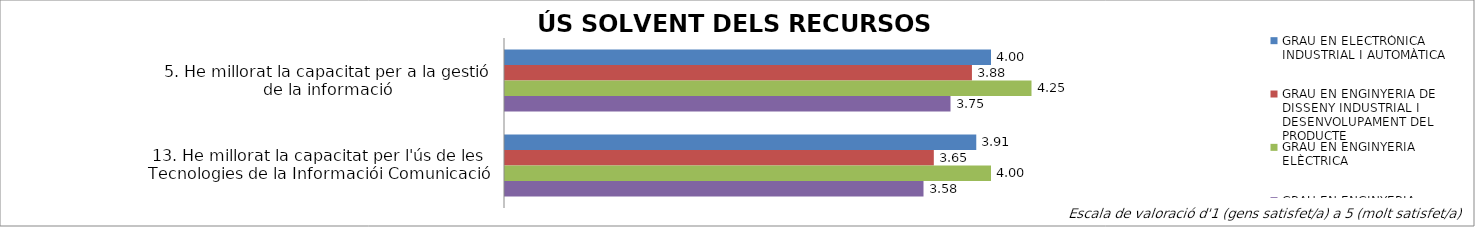
| Category | GRAU EN ELECTRÒNICA INDUSTRIAL I AUTOMÀTICA | GRAU EN ENGINYERIA DE DISSENY INDUSTRIAL I DESENVOLUPAMENT DEL PRODUCTE | GRAU EN ENGINYERIA ELÈCTRICA | GRAU EN ENGINYERIA MECÀNICA |
|---|---|---|---|---|
| 5. He millorat la capacitat per a la gestió de la informació | 4 | 3.882 | 4.25 | 3.75 |
| 13. He millorat la capacitat per l'ús de les Tecnologies de la Informaciói Comunicació | 3.909 | 3.647 | 4 | 3.583 |